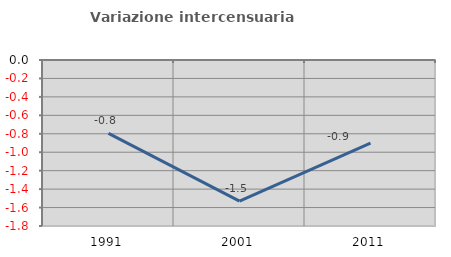
| Category | Variazione intercensuaria annua |
|---|---|
| 1991.0 | -0.796 |
| 2001.0 | -1.53 |
| 2011.0 | -0.902 |